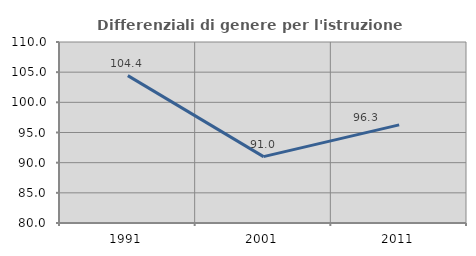
| Category | Differenziali di genere per l'istruzione superiore |
|---|---|
| 1991.0 | 104.425 |
| 2001.0 | 91.006 |
| 2011.0 | 96.264 |